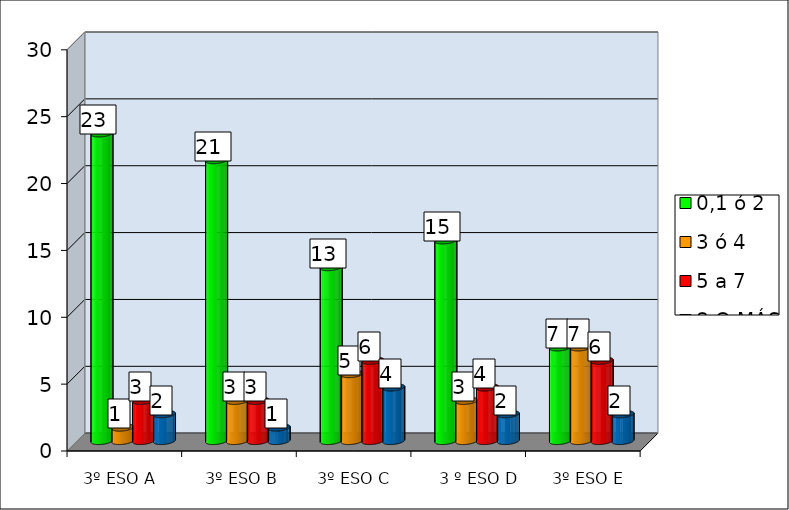
| Category | 0,1 ó 2  | 3 ó 4 | 5 a 7 | 8 O MÁS |
|---|---|---|---|---|
|  | 23 | 1 | 3 | 2 |
|  | 21 | 3 | 3 | 1 |
|  | 13 | 5 | 6 | 4 |
|  | 15 | 3 | 4 | 2 |
|  | 7 | 7 | 6 | 2 |